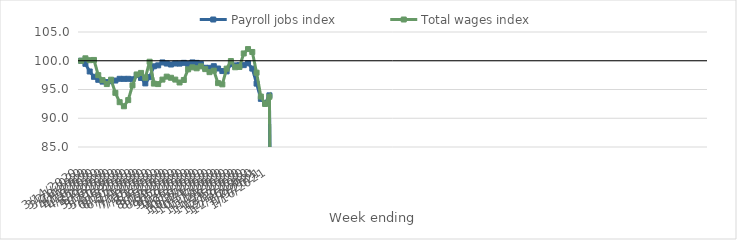
| Category | Payroll jobs index | Total wages index |
|---|---|---|
| 14/03/2020 | 100 | 100 |
| 21/03/2020 | 99.466 | 100.426 |
| 28/03/2020 | 98.131 | 100.099 |
| 04/04/2020 | 97.204 | 100.14 |
| 11/04/2020 | 96.686 | 97.499 |
| 18/04/2020 | 96.372 | 96.628 |
| 25/04/2020 | 96.295 | 95.945 |
| 02/05/2020 | 96.438 | 96.704 |
| 09/05/2020 | 96.558 | 94.42 |
| 16/05/2020 | 96.861 | 92.794 |
| 23/05/2020 | 96.85 | 92.083 |
| 30/05/2020 | 96.861 | 93.157 |
| 06/06/2020 | 96.776 | 95.714 |
| 13/06/2020 | 97.506 | 97.617 |
| 20/06/2020 | 97.013 | 97.884 |
| 27/06/2020 | 96.062 | 97.046 |
| 04/07/2020 | 97.148 | 99.831 |
| 11/07/2020 | 99.034 | 96.028 |
| 18/07/2020 | 99.2 | 95.942 |
| 25/07/2020 | 99.709 | 96.721 |
| 01/08/2020 | 99.514 | 97.238 |
| 08/08/2020 | 99.344 | 97.039 |
| 15/08/2020 | 99.522 | 96.722 |
| 22/08/2020 | 99.502 | 96.221 |
| 29/08/2020 | 99.636 | 96.658 |
| 05/09/2020 | 99.436 | 98.503 |
| 12/09/2020 | 99.709 | 98.852 |
| 19/09/2020 | 99.632 | 98.686 |
| 26/09/2020 | 99.425 | 99.02 |
| 03/10/2020 | 98.779 | 98.544 |
| 10/10/2020 | 98.766 | 98.018 |
| 17/10/2020 | 99.053 | 98.273 |
| 24/10/2020 | 98.651 | 96.108 |
| 31/10/2020 | 98.208 | 95.892 |
| 07/11/2020 | 98.149 | 98.626 |
| 14/11/2020 | 99.412 | 99.95 |
| 21/11/2020 | 99.191 | 98.869 |
| 28/11/2020 | 99.244 | 98.92 |
| 05/12/2020 | 99.239 | 101.272 |
| 12/12/2020 | 99.561 | 102.03 |
| 19/12/2020 | 98.636 | 101.526 |
| 26/12/2020 | 96.025 | 97.925 |
| 02/01/2021 | 93.376 | 93.772 |
| 09/01/2021 | 92.608 | 92.483 |
| 16/01/2021 | 93.981 | 93.742 |